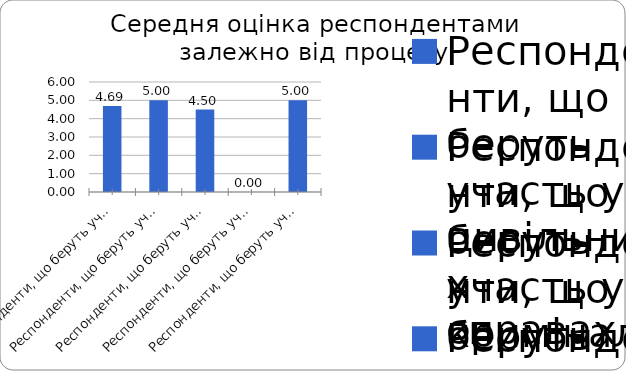
| Category | Series 0 |
|---|---|
| Респонденти, що беруть участь у цивільних справах | 4.688 |
| Респонденти, що беруть участь у кримінальних справах | 5 |
| Респонденти, що беруть участь у адміністративних справах | 4.5 |
| Респонденти, що беруть участь у господарських справах | 0 |
| Респонденти, що беруть участь у справах про адміністративні правопорушення | 5 |